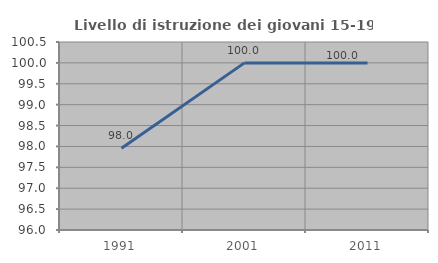
| Category | Livello di istruzione dei giovani 15-19 anni |
|---|---|
| 1991.0 | 97.959 |
| 2001.0 | 100 |
| 2011.0 | 100 |